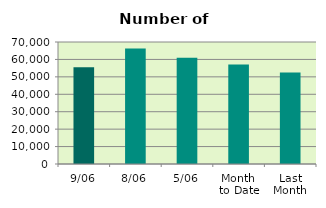
| Category | Series 0 |
|---|---|
| 9/06 | 55502 |
| 8/06 | 66220 |
| 5/06 | 60980 |
| Month 
to Date | 57028.286 |
| Last
Month | 52506.1 |